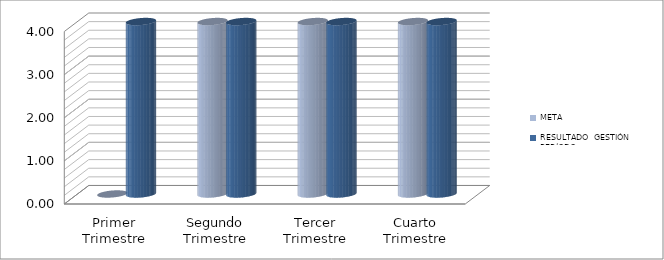
| Category | META | RESULTADO  GESTIÓN PERÍODO |
|---|---|---|
| Primer Trimestre | 0 | 4 |
| Segundo Trimestre | 5 | 4 |
| Tercer Trimestre | 5 | 6 |
| Cuarto Trimestre | 11 | 7 |